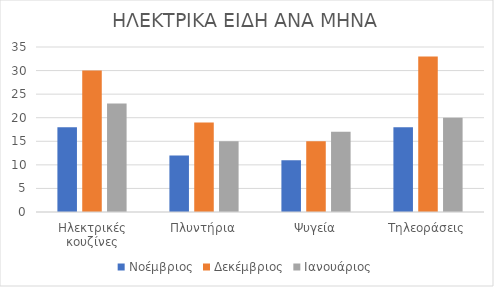
| Category | Νοέμβριος | Δεκέμβριος | Ιανουάριος |
|---|---|---|---|
| Ηλεκτρικές κουζίνες | 18 | 30 | 23 |
| Πλυντήρια | 12 | 19 | 15 |
| Ψυγεία | 11 | 15 | 17 |
| Τηλεοράσεις | 18 | 33 | 20 |